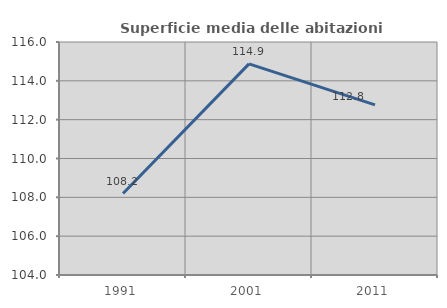
| Category | Superficie media delle abitazioni occupate |
|---|---|
| 1991.0 | 108.196 |
| 2001.0 | 114.872 |
| 2011.0 | 112.758 |